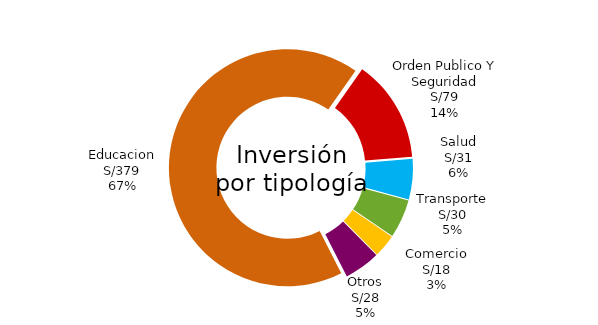
| Category | Monto 
(en MM) |
|---|---|
| Educacion | 379.025 |
| Orden Publico Y Seguridad | 78.825 |
| Salud | 31.045 |
| Transporte | 29.54 |
| Comercio | 17.547 |
| Otros | 27.693 |